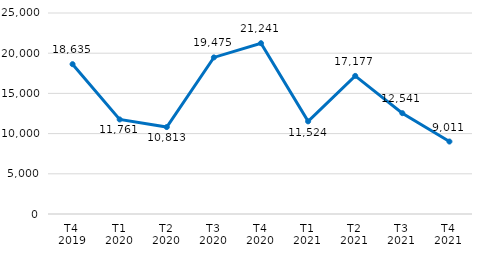
| Category | Series 0 |
|---|---|
| T4 
2019 | 18634.641 |
| T1
2020 | 11761.027 |
| T2
2020 | 10813.013 |
| T3
2020 | 19474.84 |
| T4
2020 | 21240.608 |
| T1
2021 | 11523.933 |
| T2
2021 | 17177.126 |
| T3
2021 | 12541.258 |
| T4
2021 | 9010.961 |